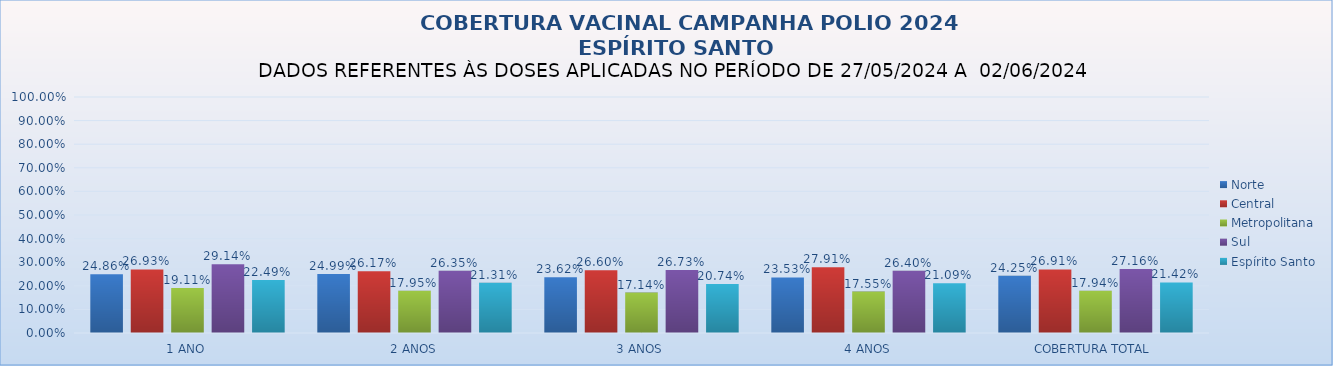
| Category | Norte | Central | Metropolitana | Sul | Espírito Santo |
|---|---|---|---|---|---|
| 1 ANO | 0.249 | 0.269 | 0.191 | 0.291 | 0.225 |
| 2 ANOS | 0.25 | 0.262 | 0.179 | 0.264 | 0.213 |
| 3 ANOS | 0.236 | 0.266 | 0.171 | 0.267 | 0.207 |
| 4 ANOS | 0.235 | 0.279 | 0.175 | 0.264 | 0.211 |
| COBERTURA TOTAL | 0.242 | 0.269 | 0.179 | 0.272 | 0.214 |